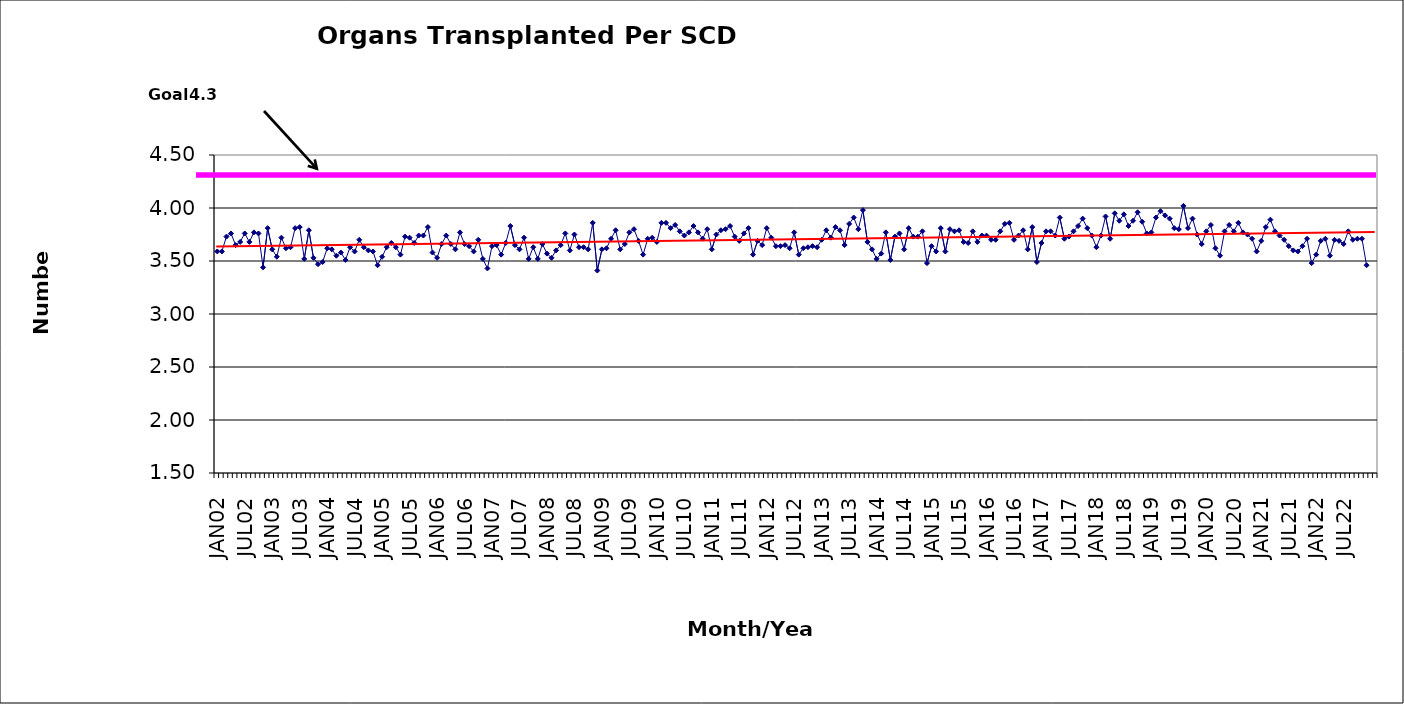
| Category | Series 0 |
|---|---|
| JAN02 | 3.59 |
| FEB02 | 3.59 |
| MAR02 | 3.73 |
| APR02 | 3.76 |
| MAY02 | 3.65 |
| JUN02 | 3.68 |
| JUL02 | 3.76 |
| AUG02 | 3.68 |
| SEP02 | 3.77 |
| OCT02 | 3.76 |
| NOV02 | 3.44 |
| DEC02 | 3.81 |
| JAN03 | 3.61 |
| FEB03 | 3.54 |
| MAR03 | 3.72 |
| APR03 | 3.62 |
| MAY03 | 3.63 |
| JUN03 | 3.81 |
| JUL03 | 3.82 |
| AUG03 | 3.52 |
| SEP03 | 3.79 |
| OCT03 | 3.53 |
| NOV03 | 3.47 |
| DEC03 | 3.49 |
| JAN04 | 3.62 |
| FEB04 | 3.61 |
| MAR04 | 3.55 |
| APR04 | 3.58 |
| MAY04 | 3.51 |
| JUN04 | 3.63 |
| JUL04 | 3.59 |
| AUG04 | 3.7 |
| SEP04 | 3.63 |
| OCT04 | 3.6 |
| NOV04 | 3.59 |
| DEC04 | 3.46 |
| JAN05 | 3.54 |
| FEB05 | 3.63 |
| MAR05 | 3.67 |
| APR05 | 3.63 |
| MAY05 | 3.56 |
| JUN05 | 3.73 |
| JUL05 | 3.72 |
| AUG05 | 3.67 |
| SEP05 | 3.74 |
| OCT05 | 3.74 |
| NOV05 | 3.82 |
| DEC05 | 3.58 |
| JAN06 | 3.53 |
| FEB06 | 3.66 |
| MAR06 | 3.74 |
| APR06 | 3.66 |
| MAY06 | 3.61 |
| JUN06 | 3.77 |
| JUL06 | 3.66 |
| AUG06 | 3.64 |
| SEP06 | 3.59 |
| OCT06 | 3.7 |
| NOV06 | 3.52 |
| DEC06 | 3.43 |
| JAN07 | 3.64 |
| FEB07 | 3.65 |
| MAR07 | 3.56 |
| APR07 | 3.67 |
| MAY07 | 3.83 |
| JUN07 | 3.65 |
| JUL07 | 3.61 |
| AUG07 | 3.72 |
| SEP07 | 3.52 |
| OCT07 | 3.63 |
| NOV07 | 3.52 |
| DEC07 | 3.66 |
| JAN08 | 3.57 |
| FEB08 | 3.53 |
| MAR08 | 3.6 |
| APR08 | 3.65 |
| MAY08 | 3.76 |
| JUN08 | 3.6 |
| JUL08 | 3.75 |
| AUG08 | 3.63 |
| SEP08 | 3.63 |
| OCT08 | 3.61 |
| NOV08 | 3.86 |
| DEC08 | 3.41 |
| JAN09 | 3.61 |
| FEB09 | 3.62 |
| MAR09 | 3.71 |
| APR09 | 3.79 |
| MAY09 | 3.61 |
| JUN09 | 3.66 |
| JUL09 | 3.77 |
| AUG09 | 3.8 |
| SEP09 | 3.69 |
| OCT09 | 3.56 |
| NOV09 | 3.71 |
| DEC09 | 3.72 |
| JAN10 | 3.68 |
| FEB10 | 3.86 |
| MAR10 | 3.86 |
| APR10 | 3.81 |
| MAY10 | 3.84 |
| JUN10 | 3.78 |
| JUL10 | 3.74 |
| AUG10 | 3.77 |
| SEP10 | 3.83 |
| OCT10 | 3.77 |
| NOV10 | 3.71 |
| DEC10 | 3.8 |
| JAN11 | 3.61 |
| FEB11 | 3.75 |
| MAR11 | 3.79 |
| APR11 | 3.8 |
| MAY11 | 3.83 |
| JUN11 | 3.73 |
| JUL11 | 3.69 |
| AUG11 | 3.76 |
| SEP11 | 3.81 |
| OCT11 | 3.56 |
| NOV11 | 3.69 |
| DEC11 | 3.65 |
| JAN12 | 3.81 |
| FEB12 | 3.72 |
| MAR12 | 3.64 |
| APR12 | 3.64 |
| MAY12 | 3.65 |
| JUN12 | 3.62 |
| JUL12 | 3.77 |
| AUG12 | 3.56 |
| SEP12 | 3.62 |
| OCT12 | 3.63 |
| NOV12 | 3.64 |
| DEC12 | 3.63 |
| JAN13 | 3.7 |
| FEB13 | 3.79 |
| MAR13 | 3.72 |
| APR13 | 3.82 |
| MAY13 | 3.79 |
| JUN13 | 3.65 |
| JUL13 | 3.85 |
| AUG13 | 3.91 |
| SEP13 | 3.8 |
| OCT13 | 3.98 |
| NOV13 | 3.68 |
| DEC13 | 3.61 |
| JAN14 | 3.52 |
| FEB14 | 3.57 |
| MAR14 | 3.77 |
| APR14 | 3.51 |
| MAY14 | 3.73 |
| JUN14 | 3.76 |
| JUL14 | 3.61 |
| AUG14 | 3.81 |
| SEP14 | 3.73 |
| OCT14 | 3.73 |
| NOV14 | 3.78 |
| DEC14 | 3.48 |
| JAN15 | 3.64 |
| FEB15 | 3.59 |
| MAR15 | 3.81 |
| APR15 | 3.59 |
| MAY15 | 3.8 |
| JUN15 | 3.78 |
| JUL15 | 3.79 |
| AUG15 | 3.68 |
| SEP15 | 3.67 |
| OCT15 | 3.78 |
| NOV15 | 3.68 |
| DEC15 | 3.74 |
| JAN16 | 3.74 |
| FEB16 | 3.7 |
| MAR16 | 3.7 |
| APR16 | 3.78 |
| MAY16 | 3.85 |
| JUN16 | 3.86 |
| JUL16 | 3.7 |
| AUG16 | 3.74 |
| SEP16 | 3.79 |
| OCT16 | 3.61 |
| NOV16 | 3.82 |
| DEC16 | 3.49 |
| JAN17 | 3.67 |
| FEB17 | 3.78 |
| MAR17 | 3.78 |
| APR17 | 3.74 |
| MAY17 | 3.91 |
| JUN17 | 3.71 |
| JUL17 | 3.73 |
| AUG17 | 3.78 |
| SEP17 | 3.83 |
| OCT17 | 3.9 |
| NOV17 | 3.81 |
| DEC17 | 3.74 |
| JAN18 | 3.63 |
| FEB18 | 3.74 |
| MAR18 | 3.92 |
| APR18 | 3.71 |
| MAY18 | 3.95 |
| JUN18 | 3.88 |
| JUL18 | 3.94 |
| AUG18 | 3.83 |
| SEP18 | 3.88 |
| OCT18 | 3.96 |
| NOV18 | 3.87 |
| DEC18 | 3.76 |
| JAN19 | 3.77 |
| FEB19 | 3.91 |
| MAR19 | 3.97 |
| APR19 | 3.93 |
| MAY19 | 3.9 |
| JUN19 | 3.81 |
| JUL19 | 3.8 |
| AUG19 | 4.02 |
| SEP19 | 3.81 |
| OCT19 | 3.9 |
| NOV19 | 3.75 |
| DEC19 | 3.66 |
| JAN20 | 3.78 |
| FEB20 | 3.84 |
| MAR20 | 3.62 |
| APR20 | 3.55 |
| MAY20 | 3.78 |
| JUN20 | 3.84 |
| JUL20 | 3.78 |
| AUG20 | 3.86 |
| SEP20 | 3.77 |
| OCT20 | 3.75 |
| NOV20 | 3.71 |
| DEC20 | 3.59 |
| JAN21 | 3.69 |
| FEB21 | 3.82 |
| MAR21 | 3.89 |
| APR21 | 3.78 |
| MAY21 | 3.74 |
| JUN21 | 3.7 |
| JUL21 | 3.64 |
| AUG21 | 3.6 |
| SEP21 | 3.59 |
| OCT21 | 3.64 |
| NOV21 | 3.71 |
| DEC21 | 3.48 |
| JAN22 | 3.56 |
| FEB22 | 3.69 |
| MAR22 | 3.71 |
| APR22 | 3.55 |
| MAY22 | 3.7 |
| JUN22 | 3.69 |
| JUL22 | 3.66 |
| AUG22 | 3.78 |
| SEP22 | 3.7 |
| OCT22 | 3.71 |
| NOV22 | 3.71 |
| DEC22 | 3.46 |